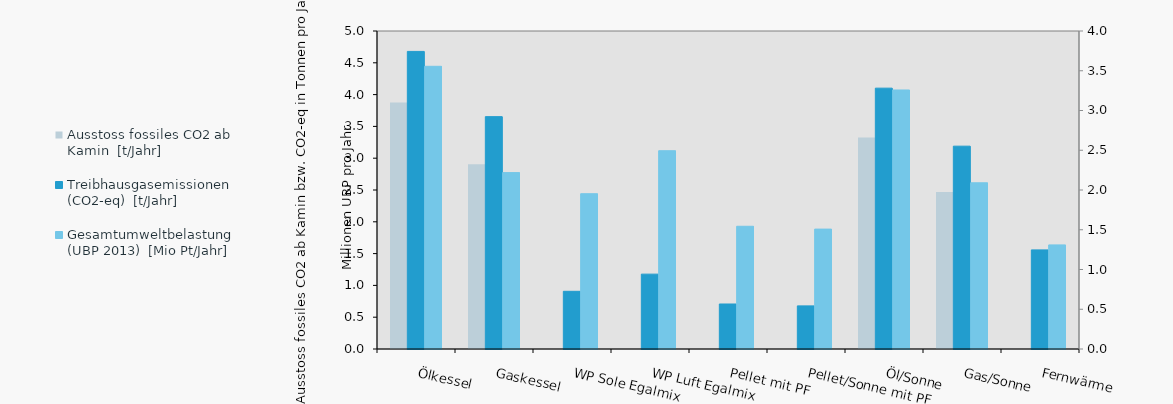
| Category | Ausstoss fossiles CO2 ab Kamin | Treibhausgasemissionen (CO2-eq) | Series 4 |
|---|---|---|---|
| Ölkessel | 3.875 | 4.679 |  |
| Gaskessel | 2.903 | 3.654 |  |
| WP Sole Egalmix | 0 | 0.907 |  |
| WP Luft Egalmix | 0 | 1.177 |  |
| Pellet mit PF | 0 | 0.708 |  |
| Pellet/Sonne mit PF | 0 | 0.678 |  |
| Öl/Sonne | 3.327 | 4.101 |  |
| Gas/Sonne | 2.468 | 3.189 |  |
| Fernwärme | 0 | 1.558 |  |